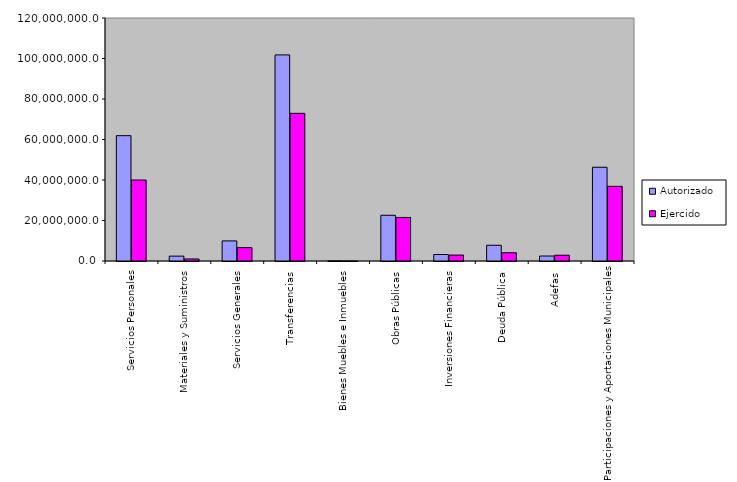
| Category | Autorizado | Ejercido |
|---|---|---|
| Servicios Personales | 61894238.6 | 39996829.6 |
| Materiales y Suministros | 2406740.8 | 1000941.2 |
| Servicios Generales | 9921790.3 | 6615983.9 |
| Transferencias | 101767959.8 | 72920901.6 |
| Bienes Muebles e Inmuebles | 60079.2 | 3913.8 |
| Obras Públicas | 22577852.5 | 21498648.7 |
| Inversiones Financieras | 3206035.1 | 2934191.7 |
| Deuda Pública | 7776765.5 | 4070524.5 |
| Adefas | 2460661.3 | 2840775.2 |
| Participaciones y Aportaciones Municipales | 46303728.5 | 36873502.9 |